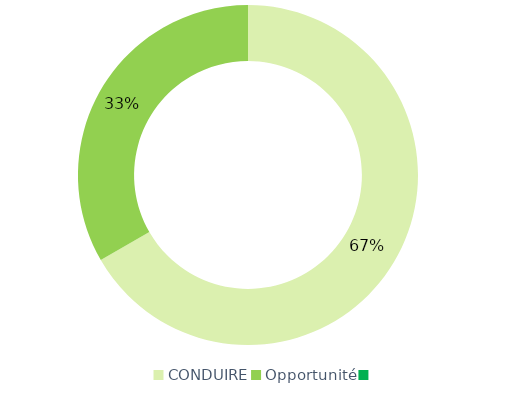
| Category | Series 0 |
|---|---|
| CONDUIRE | 44 |
| Opportunité | 22 |